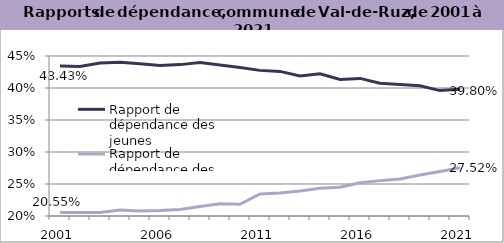
| Category | Rapport de dépendance des jeunes | Rapport de dépendance des personnes âgées |
|---|---|---|
| 2001.0 | 0.434 | 0.206 |
| 2002.0 | 0.434 | 0.205 |
| 2003.0 | 0.439 | 0.205 |
| 2004.0 | 0.44 | 0.21 |
| 2005.0 | 0.438 | 0.208 |
| 2006.0 | 0.435 | 0.209 |
| 2007.0 | 0.437 | 0.21 |
| 2008.0 | 0.44 | 0.215 |
| 2009.0 | 0.436 | 0.219 |
| 2010.0 | 0.432 | 0.218 |
| 2011.0 | 0.428 | 0.234 |
| 2012.0 | 0.426 | 0.236 |
| 2013.0 | 0.419 | 0.239 |
| 2014.0 | 0.422 | 0.243 |
| 2015.0 | 0.413 | 0.245 |
| 2016.0 | 0.415 | 0.252 |
| 2017.0 | 0.408 | 0.255 |
| 2018.0 | 0.406 | 0.258 |
| 2019.0 | 0.403 | 0.264 |
| 2020.0 | 0.396 | 0.27 |
| 2021.0 | 0.398 | 0.275 |